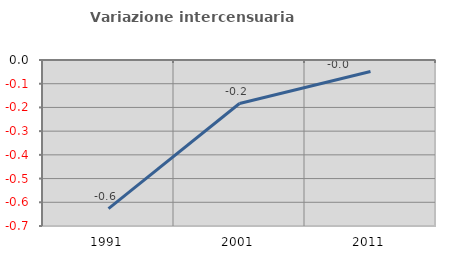
| Category | Variazione intercensuaria annua |
|---|---|
| 1991.0 | -0.627 |
| 2001.0 | -0.183 |
| 2011.0 | -0.048 |